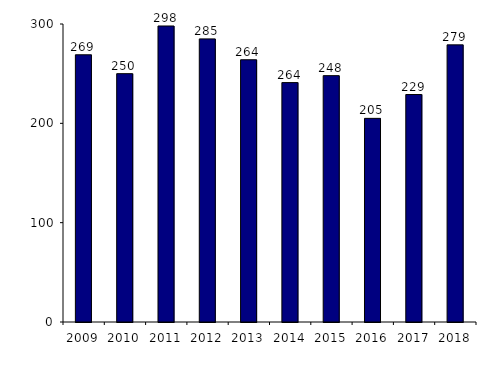
| Category | Nombre d'allogreffes |
|---|---|
| 2009.0 | 269 |
| 2010.0 | 250 |
| 2011.0 | 298 |
| 2012.0 | 285 |
| 2013.0 | 264 |
| 2014.0 | 241 |
| 2015.0 | 248 |
| 2016.0 | 205 |
| 2017.0 | 229 |
| 2018.0 | 279 |